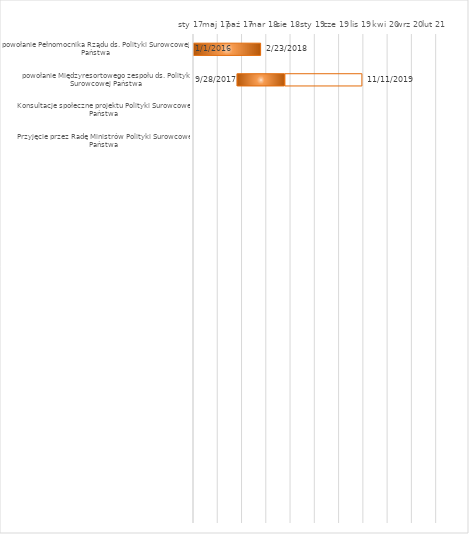
| Category | Data rozpoczęcia 
(RRRR-MM-DD) #ADR! #ADR! | <> | Data zakończenia
(RRRR-MM-DD) #ADR! #ADR! |
|---|---|---|---|
| powołanie Pełnomocnika Rządu ds. Polityki Surowcowej Państwa | 42370 | 0 | 43154 |
| powołanie Międzyresortowego zespołu ds. Polityki Surowcowej Państwa | 43006 | 479 | 43780 |
| Konsultacje społeczne projektu Polityki Surowcowej Państwa | 0 | 0 | 0 |
| Przyjęcie przez Radę Ministrów Polityki Surowcowej Państwa | 0 | 0 | 0 |